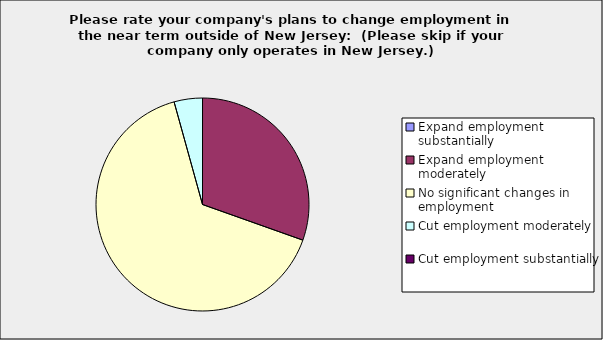
| Category | Series 0 |
|---|---|
| Expand employment substantially | 0 |
| Expand employment moderately | 0.304 |
| No significant changes in employment | 0.652 |
| Cut employment moderately | 0.043 |
| Cut employment substantially | 0 |